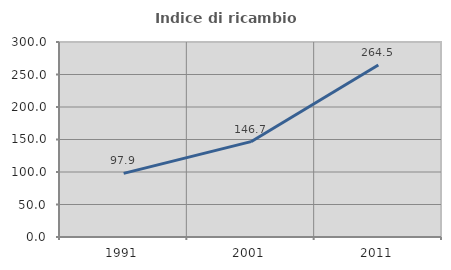
| Category | Indice di ricambio occupazionale  |
|---|---|
| 1991.0 | 97.872 |
| 2001.0 | 146.667 |
| 2011.0 | 264.493 |